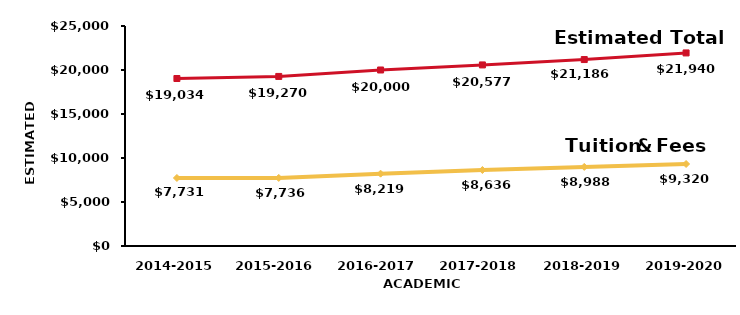
| Category | Tuition and Fees | Estimated Total |
|---|---|---|
|  2014-2015 | 7731 | 19034 |
| 2015-2016 | 7735.9 | 19269.9 |
| 2016-2017 | 8219.4 | 20000.4 |
| 2017-2018 | 8635.9 | 20576.9 |
|  2018-2019 | 8988.4 | 21186.4 |
|  2019-2020 | 9319.9 | 21939.9 |